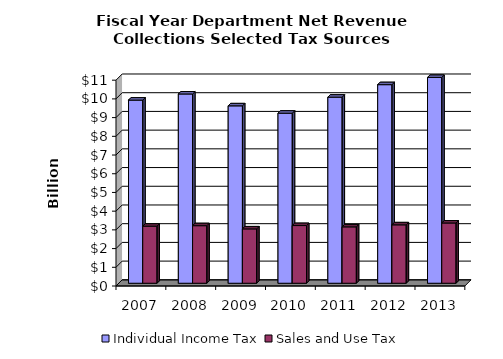
| Category | Individual Income Tax | Sales and Use Tax |
|---|---|---|
| 2007.0 | 9.788 | 3.049 |
| 2008.0 | 10.115 | 3.076 |
| 2009.0 | 9.481 | 2.904 |
| 2010.0 | 9.088 | 3.083 |
| 2011.0 | 9.944 | 3.012 |
| 2012.0 | 10.613 | 3.122 |
| 2013.0 | 11.34 | 3.22 |